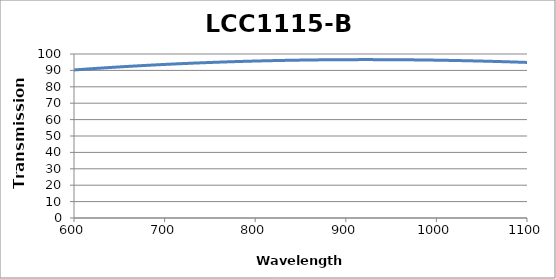
| Category | LCC1115-B Transmission |
|---|---|
| 600.0 | 90.26 |
| 602.0 | 90.341 |
| 604.0 | 90.422 |
| 606.0 | 90.501 |
| 608.0 | 90.581 |
| 610.0 | 90.659 |
| 612.0 | 90.737 |
| 614.0 | 90.815 |
| 616.0 | 90.892 |
| 618.0 | 90.968 |
| 620.0 | 91.044 |
| 622.0 | 91.119 |
| 624.0 | 91.194 |
| 626.0 | 91.268 |
| 628.0 | 91.342 |
| 630.0 | 91.415 |
| 632.0 | 91.488 |
| 634.0 | 91.56 |
| 636.0 | 91.631 |
| 638.0 | 91.702 |
| 640.0 | 91.773 |
| 642.0 | 91.843 |
| 644.0 | 91.912 |
| 646.0 | 91.981 |
| 648.0 | 92.049 |
| 650.0 | 92.117 |
| 652.0 | 92.184 |
| 654.0 | 92.251 |
| 656.0 | 92.317 |
| 658.0 | 92.382 |
| 660.0 | 92.447 |
| 662.0 | 92.512 |
| 664.0 | 92.576 |
| 666.0 | 92.639 |
| 668.0 | 92.702 |
| 670.0 | 92.765 |
| 672.0 | 92.826 |
| 674.0 | 92.888 |
| 676.0 | 92.948 |
| 678.0 | 93.009 |
| 680.0 | 93.068 |
| 682.0 | 93.128 |
| 684.0 | 93.186 |
| 686.0 | 93.244 |
| 688.0 | 93.302 |
| 690.0 | 93.359 |
| 692.0 | 93.416 |
| 694.0 | 93.472 |
| 696.0 | 93.527 |
| 698.0 | 93.582 |
| 700.0 | 93.636 |
| 702.0 | 93.69 |
| 704.0 | 93.744 |
| 706.0 | 93.797 |
| 708.0 | 93.849 |
| 710.0 | 93.901 |
| 712.0 | 93.952 |
| 714.0 | 94.003 |
| 716.0 | 94.053 |
| 718.0 | 94.103 |
| 720.0 | 94.152 |
| 722.0 | 94.201 |
| 724.0 | 94.249 |
| 726.0 | 94.297 |
| 728.0 | 94.344 |
| 730.0 | 94.391 |
| 732.0 | 94.437 |
| 734.0 | 94.482 |
| 736.0 | 94.528 |
| 738.0 | 94.572 |
| 740.0 | 94.616 |
| 742.0 | 94.66 |
| 744.0 | 94.703 |
| 746.0 | 94.746 |
| 748.0 | 94.788 |
| 750.0 | 94.829 |
| 752.0 | 94.87 |
| 754.0 | 94.911 |
| 756.0 | 94.951 |
| 758.0 | 94.99 |
| 760.0 | 95.029 |
| 762.0 | 95.068 |
| 764.0 | 95.106 |
| 766.0 | 95.143 |
| 768.0 | 95.18 |
| 770.0 | 95.217 |
| 772.0 | 95.253 |
| 774.0 | 95.288 |
| 776.0 | 95.323 |
| 778.0 | 95.358 |
| 780.0 | 95.392 |
| 782.0 | 95.426 |
| 784.0 | 95.459 |
| 786.0 | 95.491 |
| 788.0 | 95.523 |
| 790.0 | 95.555 |
| 792.0 | 95.586 |
| 794.0 | 95.616 |
| 796.0 | 95.646 |
| 798.0 | 95.676 |
| 800.0 | 95.705 |
| 802.0 | 95.734 |
| 804.0 | 95.762 |
| 806.0 | 95.789 |
| 808.0 | 95.816 |
| 810.0 | 95.843 |
| 812.0 | 95.869 |
| 814.0 | 95.895 |
| 816.0 | 95.92 |
| 818.0 | 95.945 |
| 820.0 | 95.969 |
| 822.0 | 95.992 |
| 824.0 | 96.016 |
| 826.0 | 96.038 |
| 828.0 | 96.061 |
| 830.0 | 96.082 |
| 832.0 | 96.104 |
| 834.0 | 96.125 |
| 836.0 | 96.145 |
| 838.0 | 96.165 |
| 840.0 | 96.184 |
| 842.0 | 96.203 |
| 844.0 | 96.221 |
| 846.0 | 96.239 |
| 848.0 | 96.257 |
| 850.0 | 96.274 |
| 852.0 | 96.29 |
| 854.0 | 96.306 |
| 856.0 | 96.322 |
| 858.0 | 96.337 |
| 860.0 | 96.352 |
| 862.0 | 96.366 |
| 864.0 | 96.379 |
| 866.0 | 96.393 |
| 868.0 | 96.405 |
| 870.0 | 96.418 |
| 872.0 | 96.429 |
| 874.0 | 96.441 |
| 876.0 | 96.451 |
| 878.0 | 96.462 |
| 880.0 | 96.472 |
| 882.0 | 96.481 |
| 884.0 | 96.49 |
| 886.0 | 96.499 |
| 888.0 | 96.507 |
| 890.0 | 96.514 |
| 892.0 | 96.522 |
| 894.0 | 96.528 |
| 896.0 | 96.534 |
| 898.0 | 96.54 |
| 900.0 | 96.545 |
| 902.0 | 96.55 |
| 904.0 | 96.555 |
| 906.0 | 96.559 |
| 908.0 | 96.562 |
| 910.0 | 96.565 |
| 912.0 | 96.568 |
| 914.0 | 96.57 |
| 916.0 | 96.571 |
| 918.0 | 96.572 |
| 920.0 | 96.573 |
| 922.0 | 96.573 |
| 924.0 | 96.573 |
| 926.0 | 96.573 |
| 928.0 | 96.572 |
| 930.0 | 96.57 |
| 932.0 | 96.568 |
| 934.0 | 96.566 |
| 936.0 | 96.563 |
| 938.0 | 96.559 |
| 940.0 | 96.556 |
| 942.0 | 96.551 |
| 944.0 | 96.547 |
| 946.0 | 96.542 |
| 948.0 | 96.536 |
| 950.0 | 96.53 |
| 952.0 | 96.524 |
| 954.0 | 96.517 |
| 956.0 | 96.509 |
| 958.0 | 96.502 |
| 960.0 | 96.493 |
| 962.0 | 96.485 |
| 964.0 | 96.476 |
| 966.0 | 96.466 |
| 968.0 | 96.456 |
| 970.0 | 96.446 |
| 972.0 | 96.435 |
| 974.0 | 96.424 |
| 976.0 | 96.412 |
| 978.0 | 96.4 |
| 980.0 | 96.387 |
| 982.0 | 96.374 |
| 984.0 | 96.361 |
| 986.0 | 96.347 |
| 988.0 | 96.332 |
| 990.0 | 96.318 |
| 992.0 | 96.302 |
| 994.0 | 96.287 |
| 996.0 | 96.271 |
| 998.0 | 96.254 |
| 1000.0 | 96.237 |
| 1002.0 | 96.22 |
| 1004.0 | 96.202 |
| 1006.0 | 96.184 |
| 1008.0 | 96.166 |
| 1010.0 | 96.147 |
| 1012.0 | 96.127 |
| 1014.0 | 96.107 |
| 1016.0 | 96.087 |
| 1018.0 | 96.066 |
| 1020.0 | 96.045 |
| 1022.0 | 96.023 |
| 1024.0 | 96.001 |
| 1026.0 | 95.979 |
| 1028.0 | 95.956 |
| 1030.0 | 95.933 |
| 1032.0 | 95.909 |
| 1034.0 | 95.885 |
| 1036.0 | 95.861 |
| 1038.0 | 95.836 |
| 1040.0 | 95.81 |
| 1042.0 | 95.785 |
| 1044.0 | 95.758 |
| 1046.0 | 95.732 |
| 1048.0 | 95.705 |
| 1050.0 | 95.678 |
| 1052.0 | 95.65 |
| 1054.0 | 95.621 |
| 1056.0 | 95.593 |
| 1058.0 | 95.564 |
| 1060.0 | 95.534 |
| 1062.0 | 95.504 |
| 1064.0 | 95.474 |
| 1066.0 | 95.444 |
| 1068.0 | 95.412 |
| 1070.0 | 95.381 |
| 1072.0 | 95.349 |
| 1074.0 | 95.317 |
| 1076.0 | 95.284 |
| 1078.0 | 95.251 |
| 1080.0 | 95.217 |
| 1082.0 | 95.184 |
| 1084.0 | 95.149 |
| 1086.0 | 95.114 |
| 1088.0 | 95.079 |
| 1090.0 | 95.044 |
| 1092.0 | 95.008 |
| 1094.0 | 94.972 |
| 1096.0 | 94.935 |
| 1098.0 | 94.898 |
| 1100.0 | 94.86 |